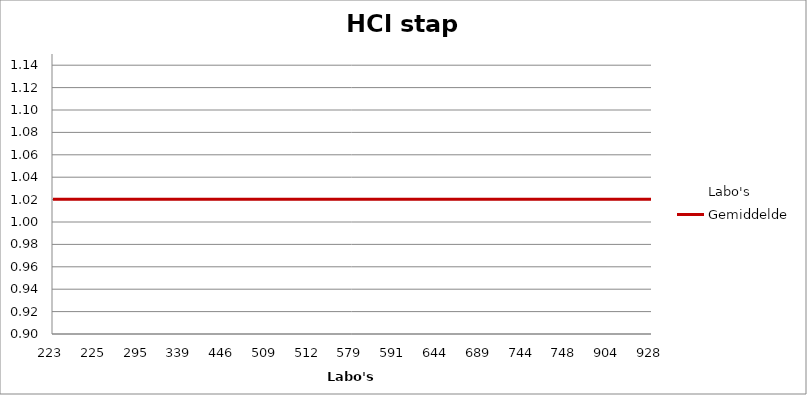
| Category | Labo's | Gemiddelde |
|---|---|---|
| 223.0 | 1.113 | 1.02 |
| 225.0 | 0.989 | 1.02 |
| 295.0 | 0.984 | 1.02 |
| 339.0 | 1.128 | 1.02 |
| 446.0 | 1.098 | 1.02 |
| 509.0 | 0.955 | 1.02 |
| 512.0 | 1.024 | 1.02 |
| 579.0 | 0.969 | 1.02 |
| 591.0 | 1.044 | 1.02 |
| 644.0 | 1.078 | 1.02 |
| 689.0 | 0.989 | 1.02 |
| 744.0 | 1.004 | 1.02 |
| 748.0 | 0.955 | 1.02 |
| 904.0 | 0.94 | 1.02 |
| 928.0 | 1.039 | 1.02 |